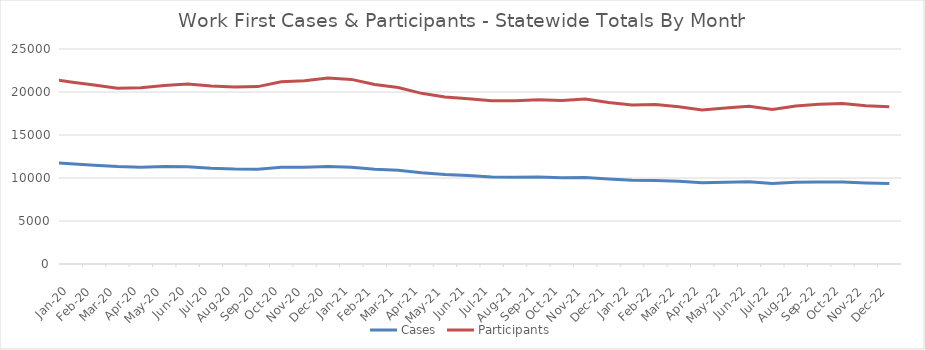
| Category | Cases | Participants |
|---|---|---|
| 2022-12-01 | 9357 | 18283 |
| 2022-11-22 | 9423 | 18412 |
| 2022-10-22 | 9547 | 18673 |
| 2022-09-22 | 9528 | 18586 |
| 2022-08-22 | 9505 | 18379 |
| 2022-07-22 | 9349 | 17973 |
| 2022-06-22 | 9561 | 18334 |
| 2022-05-22 | 9493 | 18139 |
| 2022-04-22 | 9434 | 17898 |
| 2022-03-22 | 9625 | 18293 |
| 2022-02-22 | 9713 | 18537 |
| 2022-01-22 | 9733 | 18484 |
| 2021-12-21 | 9885 | 18776 |
| 2021-11-21 | 10056 | 19192 |
| 2021-10-21 | 10034 | 19005 |
| 2021-09-21 | 10102 | 19085 |
| 2021-08-21 | 10090 | 18974 |
| 2021-07-21 | 10121 | 18988 |
| 2021-06-21 | 10298 | 19211 |
| 2021-05-21 | 10411 | 19413 |
| 2021-04-21 | 10601 | 19845 |
| 2021-03-21 | 10888 | 20521 |
| 2021-02-21 | 11007 | 20877 |
| 2021-01-21 | 11252 | 21466 |
| 2020-12-20 | 11350 | 21641 |
| 2020-11-20 | 11255 | 21305 |
| 2020-10-20 | 11243 | 21198 |
| 2020-09-20 | 11030 | 20626 |
| 2020-08-20 | 11034 | 20575 |
| 2020-07-20 | 11137 | 20693 |
| 2020-06-20 | 11320 | 20921 |
| 2020-05-20 | 11330 | 20766 |
| 2020-04-20 | 11263 | 20490 |
| 2020-03-20 | 11330 | 20431 |
| 2020-02-20 | 11473 | 20821 |
| 2020-01-20 | 11654 | 21174 |
| 2019-12-19 | 11822 | 21539 |
| 2019-11-19 | 11990 | 21921 |